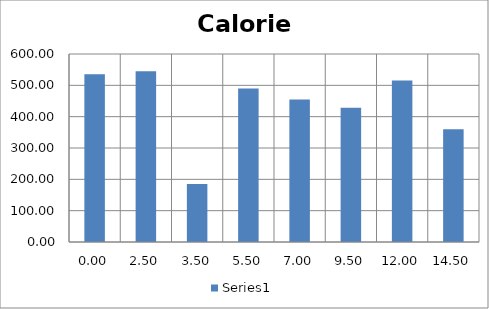
| Category | Series 0 |
|---|---|
| 0.0 | 535.634 |
| 2.5 | 545.04 |
| 3.5 | 185 |
| 5.5 | 490 |
| 7.0 | 455.04 |
| 9.5 | 428.16 |
| 12.0 | 515.52 |
| 14.5 | 360 |